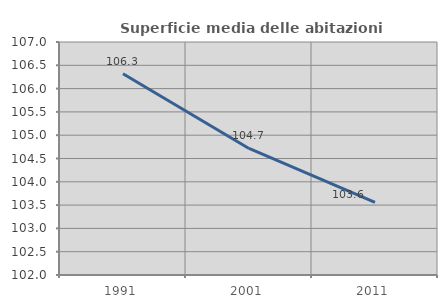
| Category | Superficie media delle abitazioni occupate |
|---|---|
| 1991.0 | 106.319 |
| 2001.0 | 104.716 |
| 2011.0 | 103.561 |